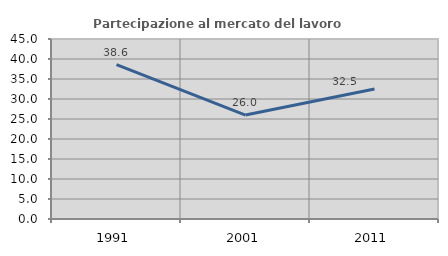
| Category | Partecipazione al mercato del lavoro  femminile |
|---|---|
| 1991.0 | 38.616 |
| 2001.0 | 25.985 |
| 2011.0 | 32.511 |